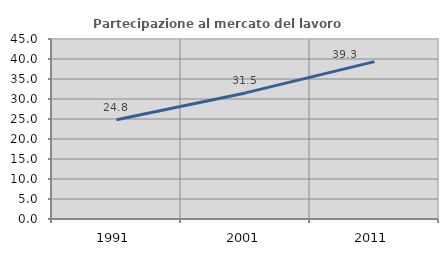
| Category | Partecipazione al mercato del lavoro  femminile |
|---|---|
| 1991.0 | 24.832 |
| 2001.0 | 31.522 |
| 2011.0 | 39.337 |